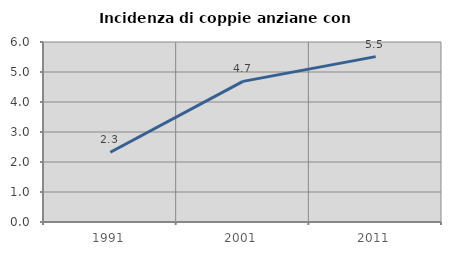
| Category | Incidenza di coppie anziane con figli |
|---|---|
| 1991.0 | 2.326 |
| 2001.0 | 4.688 |
| 2011.0 | 5.512 |